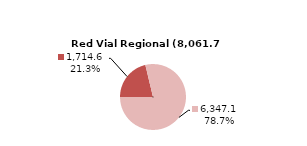
| Category | RV Regional |
|---|---|
| Pavimentada | 1714.602 |
| No Pavimentada | 6347.111 |